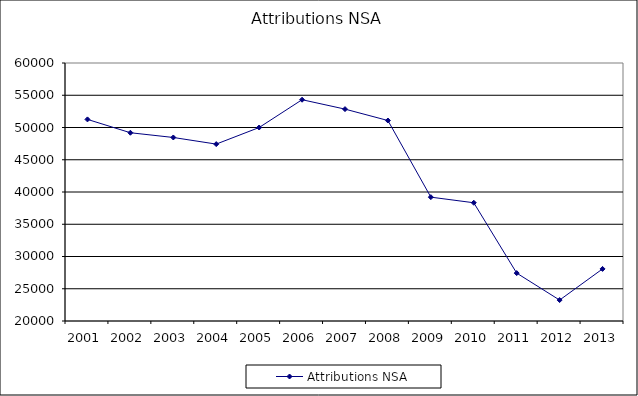
| Category | Attributions NSA |
|---|---|
| 2001.0 | 51256 |
| 2002.0 | 49188 |
| 2003.0 | 48453 |
| 2004.0 | 47425 |
| 2005.0 | 50000 |
| 2006.0 | 54309 |
| 2007.0 | 52850 |
| 2008.0 | 51082 |
| 2009.0 | 39203 |
| 2010.0 | 38333 |
| 2011.0 | 27426 |
| 2012.0 | 23246 |
| 2013.0 | 28076 |